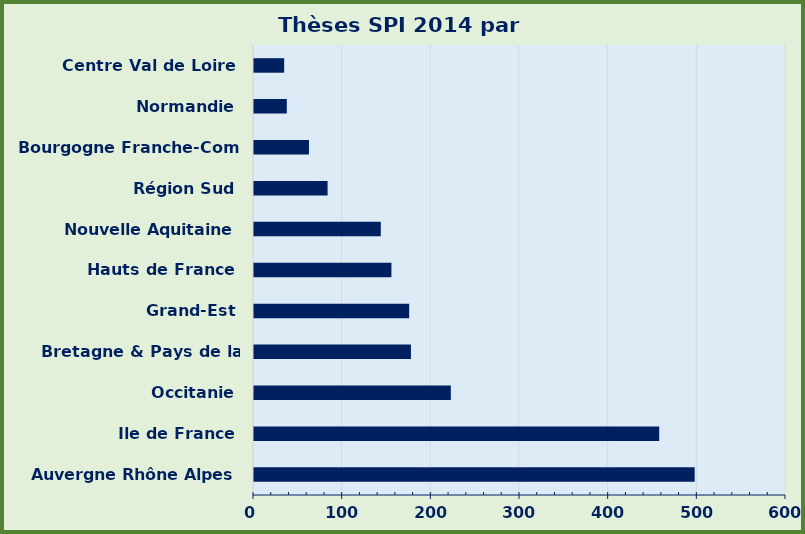
| Category | Series 0 |
|---|---|
| Auvergne Rhône Alpes | 497 |
| Ile de France | 457 |
| Occitanie | 222 |
| Bretagne & Pays de la Loire | 177 |
| Grand-Est | 175 |
| Hauts de France | 155 |
| Nouvelle Aquitaine | 143 |
| Région Sud | 83 |
| Bourgogne Franche-Comté | 62 |
| Normandie | 37 |
| Centre Val de Loire​ | 34 |